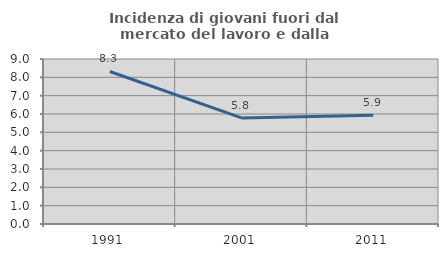
| Category | Incidenza di giovani fuori dal mercato del lavoro e dalla formazione  |
|---|---|
| 1991.0 | 8.32 |
| 2001.0 | 5.788 |
| 2011.0 | 5.937 |